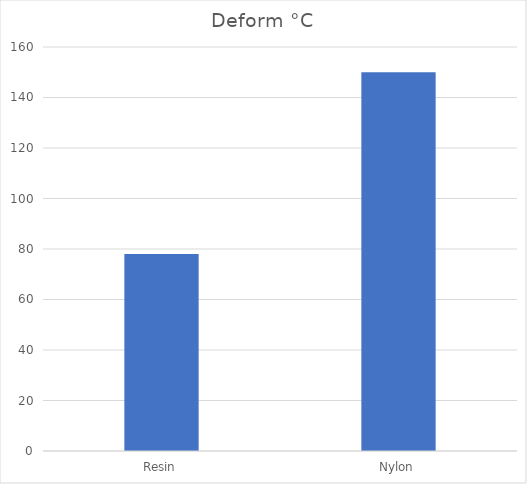
| Category | Deform °C |
|---|---|
| Resin | 78 |
| Nylon | 150 |